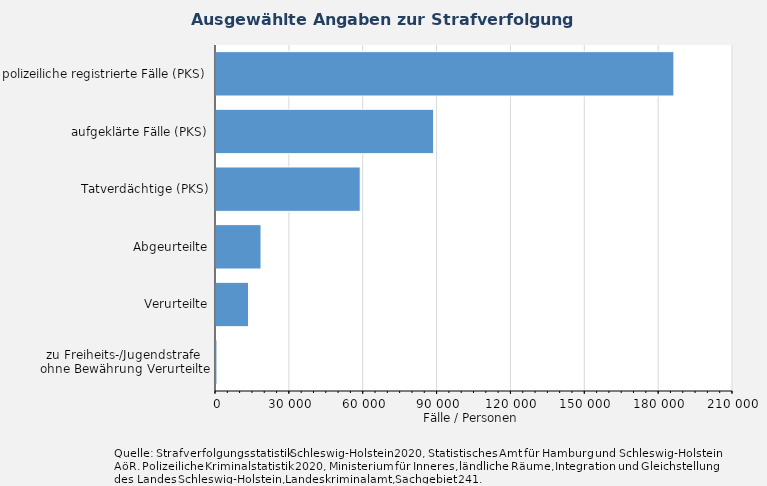
| Category | Fälle / Personen |
|---|---|
| polizeiliche registrierte Fälle (PKS) | 186403 |
| aufgeklärte Fälle (PKS) | 88818 |
| Tatverdächtige (PKS) | 58988 |
| Abgeurteilte | 18689 |
| Verurteilte | 13620 |
| zu Freiheits-/Jugendstrafe 
ohne Bewährung Verurteilte | 795 |